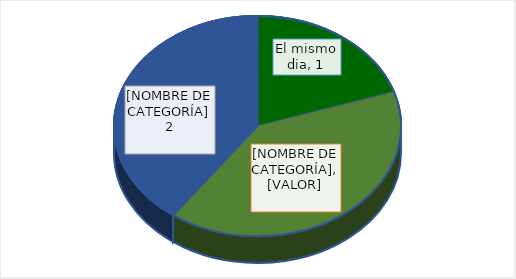
| Category | Series 0 |
|---|---|
| El mismo dia | 1 |
| Antes de 10 días | 2 |
| Antes de 15 días | 2 |